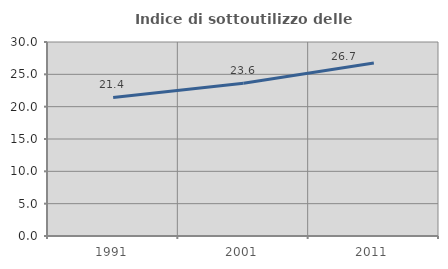
| Category | Indice di sottoutilizzo delle abitazioni  |
|---|---|
| 1991.0 | 21.427 |
| 2001.0 | 23.61 |
| 2011.0 | 26.749 |